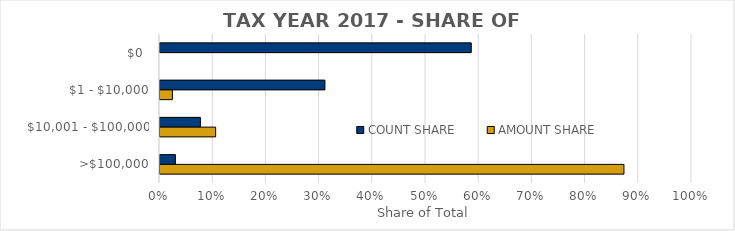
| Category | COUNT SHARE | AMOUNT SHARE |
|---|---|---|
| $0  | 0.585 | 0 |
| $1 - $10,000 | 0.31 | 0.023 |
| $10,001 - $100,000 | 0.076 | 0.105 |
| >$100,000 | 0.029 | 0.872 |